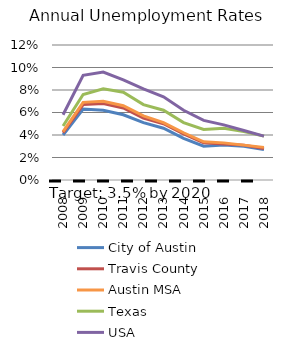
| Category | City of Austin | Travis County | Austin MSA | Texas | USA |
|---|---|---|---|---|---|
| 2008.0 | 0.04 | 0.042 | 0.043 | 0.048 | 0.058 |
| 2009.0 | 0.063 | 0.067 | 0.069 | 0.076 | 0.093 |
| 2010.0 | 0.062 | 0.068 | 0.07 | 0.081 | 0.096 |
| 2011.0 | 0.058 | 0.064 | 0.066 | 0.078 | 0.089 |
| 2012.0 | 0.051 | 0.055 | 0.057 | 0.067 | 0.081 |
| 2013.0 | 0.046 | 0.05 | 0.051 | 0.062 | 0.074 |
| 2014.0 | 0.037 | 0.041 | 0.042 | 0.051 | 0.062 |
| 2015.0 | 0.03 | 0.033 | 0.034 | 0.045 | 0.053 |
| 2016.0 | 0.031 | 0.032 | 0.033 | 0.046 | 0.049 |
| 2017.0 | 0.03 | 0.031 | 0.031 | 0.043 | 0.044 |
| 2018.0 | 0.027 | 0.028 | 0.029 | 0.039 | 0.039 |